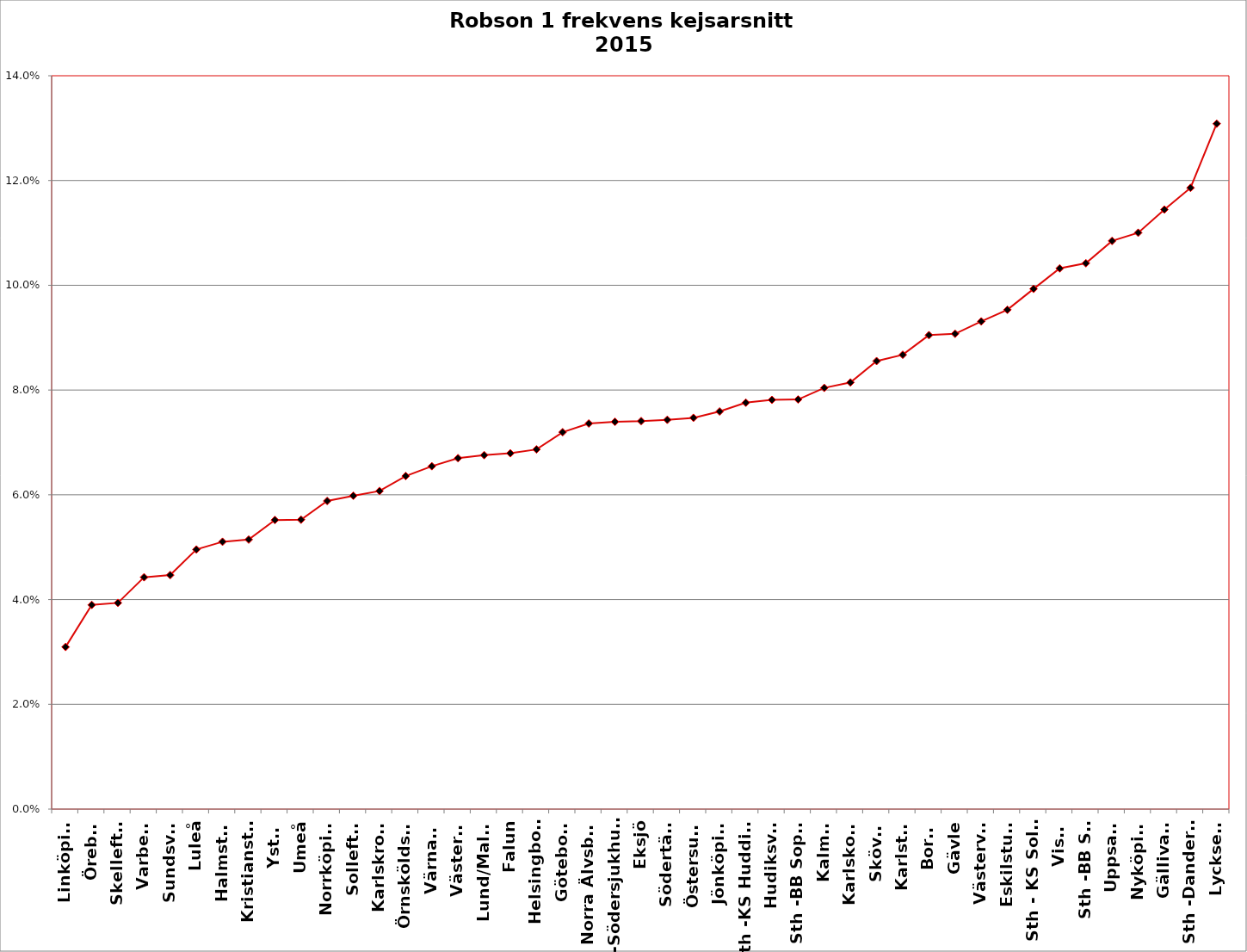
| Category | Robson 1 frekvens kejsarsnitt 2015 |
|---|---|
| Linköping | 0.031 |
| Örebro | 0.039 |
| Skellefteå | 0.039 |
| Varberg | 0.044 |
| Sundsvall | 0.045 |
| Luleå | 0.05 |
| Halmstad | 0.051 |
| Kristianstad | 0.051 |
| Ystad | 0.055 |
| Umeå | 0.055 |
| Norrköping | 0.059 |
| Sollefteå | 0.06 |
| Karlskrona | 0.061 |
| Örnsköldsvik | 0.064 |
| Värnamo | 0.065 |
| Västerås | 0.067 |
| Lund/Malmö | 0.068 |
| Falun | 0.068 |
| Helsingborg | 0.069 |
| Göteborg | 0.072 |
| Norra Älvsborg | 0.074 |
| Sth -Södersjukhuset | 0.074 |
| Eksjö | 0.074 |
| Södertälje | 0.074 |
| Östersund | 0.075 |
| Jönköping | 0.076 |
| Sth -KS Huddinge | 0.078 |
| Hudiksvall | 0.078 |
| Sth -BB Sophia | 0.078 |
| Kalmar | 0.08 |
| Karlskoga | 0.081 |
| Skövde | 0.086 |
| Karlstad | 0.087 |
| Borås | 0.09 |
| Gävle | 0.091 |
| Västervik | 0.093 |
| Eskilstuna | 0.095 |
| Sth - KS Solna | 0.099 |
| Visby | 0.103 |
| Sth -BB Sth | 0.104 |
| Uppsala | 0.108 |
| Nyköping | 0.11 |
| Gällivare | 0.114 |
| Sth -Danderyd | 0.119 |
| Lycksele | 0.131 |